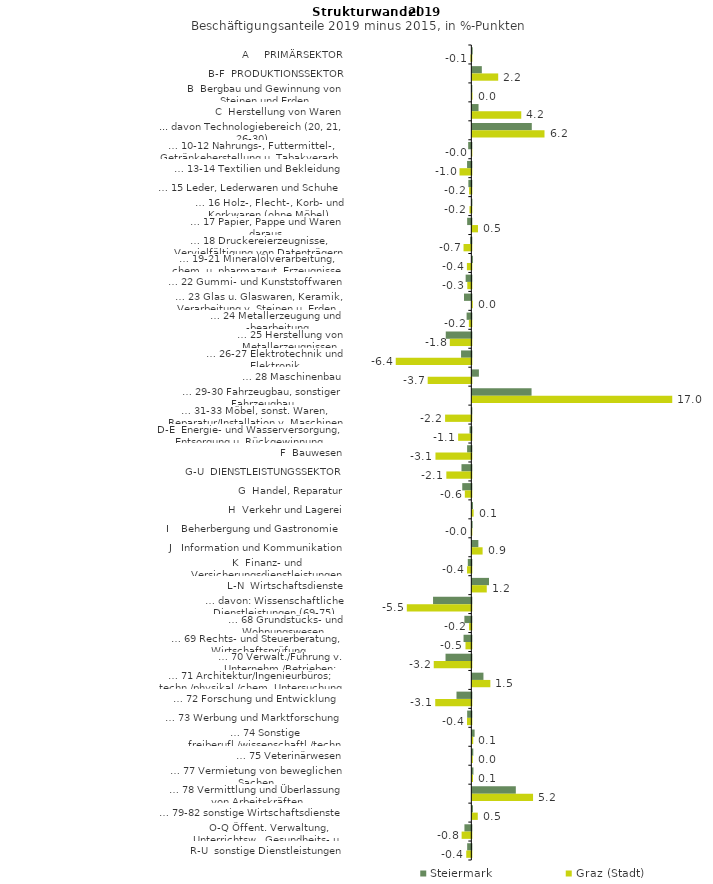
| Category | Steiermark | Graz (Stadt) |
|---|---|---|
| A     PRIMÄRSEKTOR | 0.031 | -0.075 |
| B-F  PRODUKTIONSSEKTOR | 0.809 | 2.205 |
| B  Bergbau und Gewinnung von Steinen und Erden | -0.014 | 0.016 |
| C  Herstellung von Waren | 0.528 | 4.169 |
| ... davon Technologiebereich (20, 21, 26-30) | 5.068 | 6.151 |
| … 10-12 Nahrungs-, Futtermittel-, Getränkeherstellung u. Tabakverarb. | -0.269 | -0.015 |
| … 13-14 Textilien und Bekleidung | -0.363 | -1.007 |
| … 15 Leder, Lederwaren und Schuhe | -0.253 | -0.191 |
| … 16 Holz-, Flecht-, Korb- und Korkwaren (ohne Möbel)  | 0.005 | -0.159 |
| … 17 Papier, Pappe und Waren daraus  | -0.355 | 0.48 |
| … 18 Druckereierzeugnisse, Vervielfältigung von Datenträgern | -0.098 | -0.665 |
| … 19-21 Mineralölverarbeitung, chem. u. pharmazeut. Erzeugnisse | 0.048 | -0.377 |
| … 22 Gummi- und Kunststoffwaren | -0.484 | -0.346 |
| … 23 Glas u. Glaswaren, Keramik, Verarbeitung v. Steinen u. Erden  | -0.625 | 0.038 |
| … 24 Metallerzeugung und -bearbeitung | -0.403 | -0.21 |
| … 25 Herstellung von Metallerzeugnissen  | -2.18 | -1.835 |
| … 26-27 Elektrotechnik und Elektronik | -0.876 | -6.442 |
| … 28 Maschinenbau | 0.559 | -3.72 |
| … 29-30 Fahrzeugbau, sonstiger Fahrzeugbau | 5.047 | 17.038 |
| … 31-33 Möbel, sonst. Waren, Reparatur/Installation v. Maschinen | -0.041 | -2.236 |
| D-E  Energie- und Wasserversorgung, Entsorgung u. Rückgewinnung | -0.153 | -1.126 |
| F  Bauwesen | -0.36 | -3.056 |
| G-U  DIENSTLEISTUNGSSEKTOR | -0.84 | -2.13 |
| G  Handel, Reparatur | -0.775 | -0.554 |
| H  Verkehr und Lagerei | 0.059 | 0.111 |
| I    Beherbergung und Gastronomie | 0.026 | -0.037 |
| J   Information und Kommunikation | 0.514 | 0.876 |
| K  Finanz- und Versicherungsdienstleistungen | -0.301 | -0.365 |
| L-N  Wirtschaftsdienste | 1.421 | 1.23 |
| … davon: Wissenschaftliche Dienstleistungen (69-75) | -3.263 | -5.498 |
| … 68 Grundstücks- und Wohnungswesen  | -0.593 | -0.196 |
| … 69 Rechts- und Steuerberatung, Wirtschaftsprüfung | -0.663 | -0.498 |
| … 70 Verwalt./Führung v. Unternehm./Betrieben; Unternehmensberat. | -2.199 | -3.203 |
| … 71 Architektur/Ingenieurbüros; techn./physikal./chem. Untersuchung | 0.947 | 1.535 |
| … 72 Forschung und Entwicklung  | -1.265 | -3.076 |
| … 73 Werbung und Marktforschung | -0.356 | -0.37 |
| … 74 Sonstige freiberufl./wissenschaftl./techn. Tätigkeiten | 0.194 | 0.076 |
| … 75 Veterinärwesen | 0.081 | 0.04 |
| … 77 Vermietung von beweglichen Sachen  | 0.093 | 0.058 |
| … 78 Vermittlung und Überlassung von Arbeitskräften | 3.706 | 5.175 |
| … 79-82 sonstige Wirtschaftsdienste | 0.053 | 0.464 |
| O-Q Öffent. Verwaltung, Unterrichtsw., Gesundheits- u. Sozialwesen | -0.588 | -0.828 |
| R-U  sonstige Dienstleistungen | -0.356 | -0.433 |